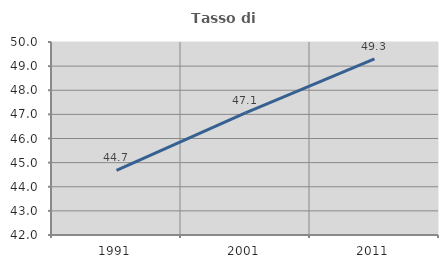
| Category | Tasso di occupazione   |
|---|---|
| 1991.0 | 44.682 |
| 2001.0 | 47.066 |
| 2011.0 | 49.296 |